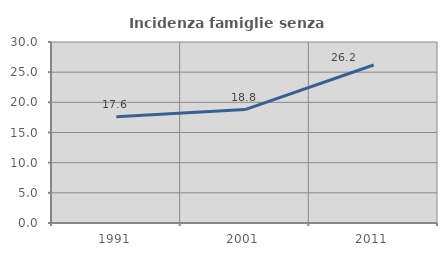
| Category | Incidenza famiglie senza nuclei |
|---|---|
| 1991.0 | 17.597 |
| 2001.0 | 18.802 |
| 2011.0 | 26.19 |